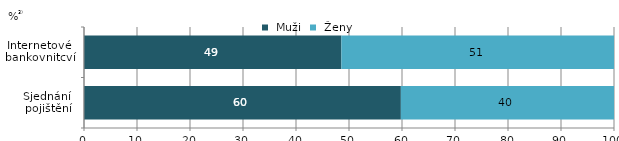
| Category |  Muži |  Ženy |
|---|---|---|
| Sjednání 
pojištění | 59.787 | 40.213 |
| Internetové 
bankovnitcví | 48.56 | 51.44 |